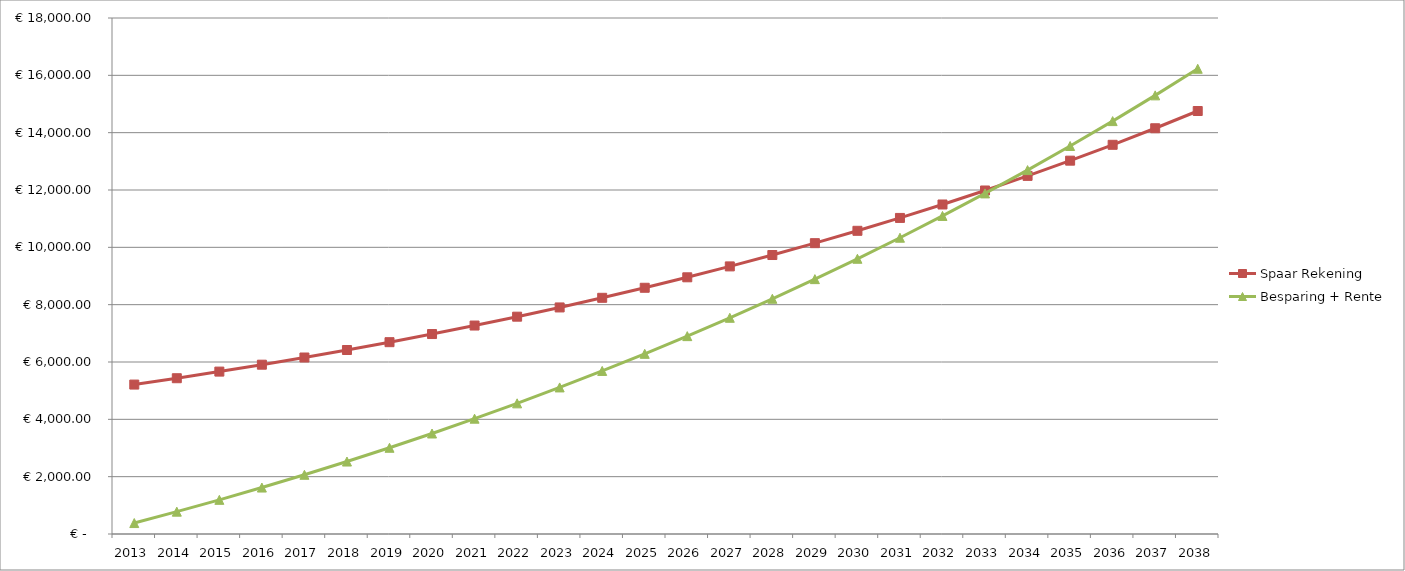
| Category | Spaar Rekening | Besparing + Rente |
|---|---|---|
| 2013.0 | 5212.5 | 381.867 |
| 2014.0 | 5434.031 | 778.895 |
| 2015.0 | 5664.978 | 1191.534 |
| 2016.0 | 5905.739 | 1620.248 |
| 2017.0 | 6156.733 | 2065.513 |
| 2018.0 | 6418.394 | 2527.816 |
| 2019.0 | 6691.176 | 3007.659 |
| 2020.0 | 6975.551 | 3505.555 |
| 2021.0 | 7272.012 | 4022.033 |
| 2022.0 | 7581.072 | 4557.634 |
| 2023.0 | 7903.268 | 5112.914 |
| 2024.0 | 8239.157 | 5688.442 |
| 2025.0 | 8589.321 | 6284.805 |
| 2026.0 | 8954.367 | 6902.602 |
| 2027.0 | 9334.928 | 7542.449 |
| 2028.0 | 9731.662 | 8204.979 |
| 2029.0 | 10145.258 | 8890.839 |
| 2030.0 | 10576.431 | 9600.695 |
| 2031.0 | 11025.93 | 10335.23 |
| 2032.0 | 11494.532 | 11095.142 |
| 2033.0 | 11983.049 | 11881.152 |
| 2034.0 | 12492.329 | 12693.994 |
| 2035.0 | 13023.253 | 13534.425 |
| 2036.0 | 13576.741 | 14403.22 |
| 2037.0 | 14153.752 | 15301.173 |
| 2038.0 | 14755.287 | 16229.1 |